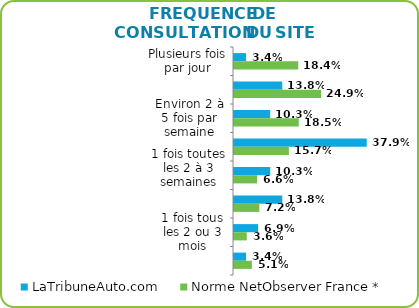
| Category | LaTribuneAuto.com | Norme NetObserver France * |
|---|---|---|
| Plusieurs fois par jour | 0.034 | 0.184 |
| Environ 1 fois par jour | 0.138 | 0.249 |
| Environ 2 à 5 fois par semaine | 0.103 | 0.185 |
| Environ 1 fois par semaine | 0.379 | 0.157 |
| 1 fois toutes les 2 à 3 semaines | 0.103 | 0.066 |
| Environ 1 fois par mois | 0.138 | 0.072 |
| 1 fois tous les 2 ou 3 mois | 0.069 | 0.036 |
| Moins souvent | 0.034 | 0.051 |